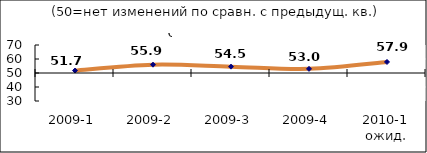
| Category | Диф.индекс ↓ |
|---|---|
| 2009-1 | 51.745 |
| 2009-2 | 55.93 |
| 2009-3 | 54.535 |
| 2009-4 | 52.96 |
| 2010-1 ожид. | 57.87 |